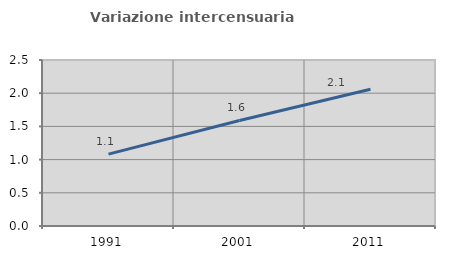
| Category | Variazione intercensuaria annua |
|---|---|
| 1991.0 | 1.083 |
| 2001.0 | 1.59 |
| 2011.0 | 2.059 |